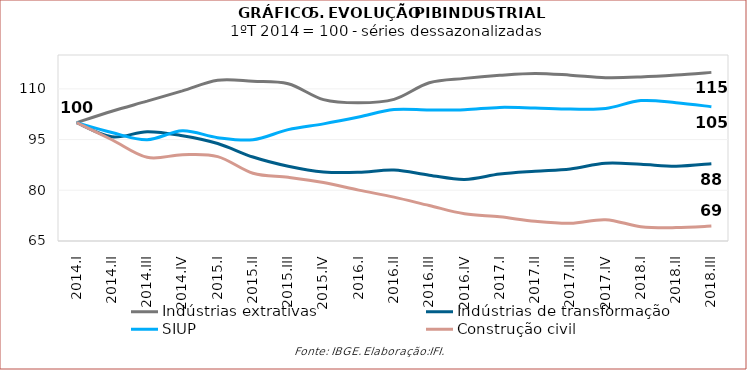
| Category | Indústrias extrativas | Indústrias de transformação | SIUP | Construção civil |
|---|---|---|---|---|
| 2014.I | 100 | 100 | 100 | 100 |
| 2014.II | 103.376 | 95.804 | 97.08 | 94.938 |
| 2014.III | 106.344 | 97.326 | 94.941 | 89.747 |
| 2014.IV | 109.383 | 96.126 | 97.588 | 90.499 |
| 2015.I | 112.512 | 93.835 | 95.563 | 89.964 |
| 2015.II | 112.221 | 89.829 | 94.933 | 85.049 |
| 2015.III | 111.487 | 87.11 | 97.937 | 83.843 |
| 2015.IV | 106.8 | 85.421 | 99.64 | 82.299 |
| 2016.I | 105.857 | 85.324 | 101.644 | 80.045 |
| 2016.II | 106.876 | 85.978 | 103.876 | 77.974 |
| 2016.III | 111.795 | 84.456 | 103.749 | 75.477 |
| 2016.IV | 113.089 | 83.218 | 103.825 | 73.036 |
| 2017.I | 113.997 | 84.789 | 104.508 | 72.149 |
| 2017.II | 114.543 | 85.637 | 104.307 | 70.823 |
| 2017.III | 114.045 | 86.321 | 104.02 | 70.228 |
| 2017.IV | 113.309 | 87.998 | 104.17 | 71.301 |
| 2018.I | 113.497 | 87.695 | 106.515 | 69.231 |
| 2018.II | 114.063 | 87.121 | 105.908 | 68.961 |
| 2018.III | 114.863 | 87.847 | 104.712 | 69.414 |